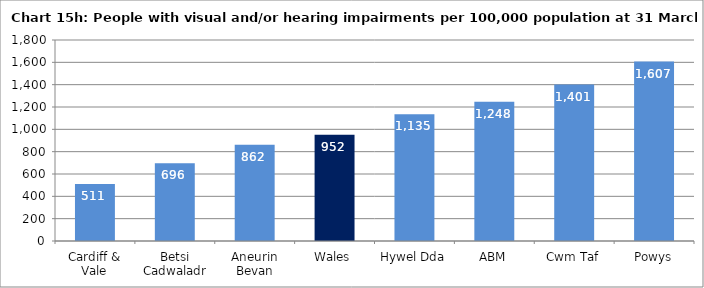
| Category | Chart 15h: People with visual and/or hearing impairments per 100,000 population at 31 March 2016 |
|---|---|
| Cardiff & Vale | 510.57 |
| Betsi Cadwaladr | 696.499 |
| Aneurin Bevan | 861.653 |
| Wales | 952.474 |
| Hywel Dda | 1134.57 |
| ABM | 1247.654 |
| Cwm Taf | 1401.25 |
| Powys | 1606.58 |